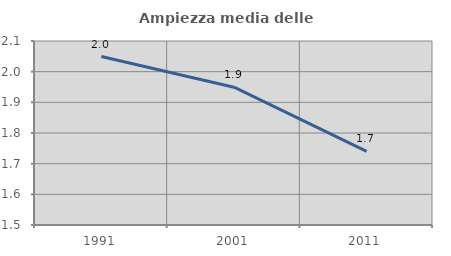
| Category | Ampiezza media delle famiglie |
|---|---|
| 1991.0 | 2.049 |
| 2001.0 | 1.949 |
| 2011.0 | 1.74 |